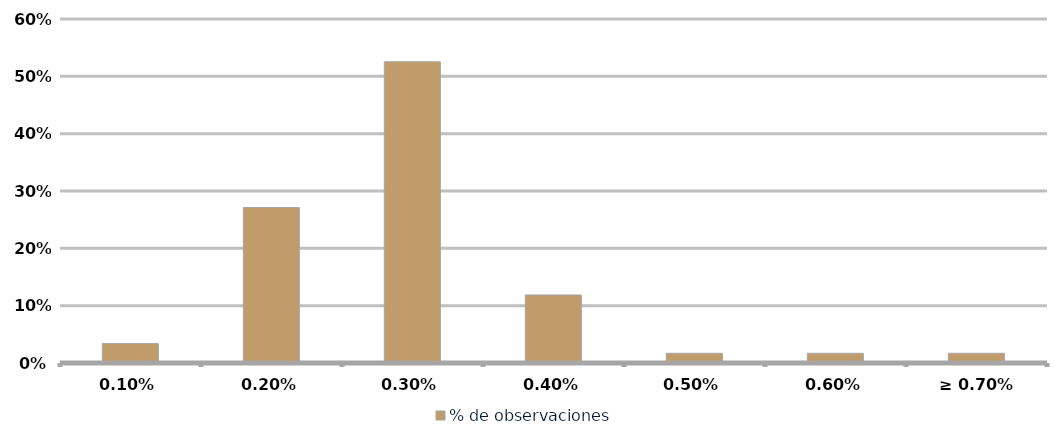
| Category | % de observaciones  |
|---|---|
| 0,10% | 0.034 |
| 0,20% | 0.271 |
| 0,30% | 0.525 |
| 0,40% | 0.119 |
| 0,50% | 0.017 |
| 0,60% | 0.017 |
| ≥ 0.70% | 0.017 |